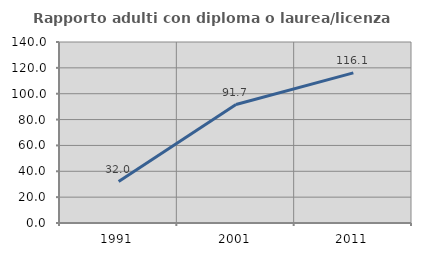
| Category | Rapporto adulti con diploma o laurea/licenza media  |
|---|---|
| 1991.0 | 32.015 |
| 2001.0 | 91.653 |
| 2011.0 | 116.1 |